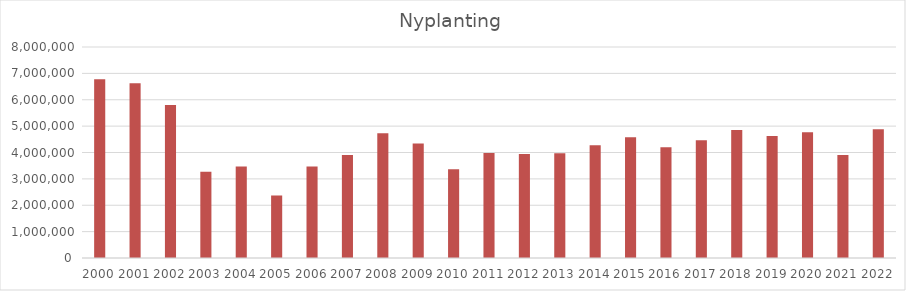
| Category | Nyplanting |
|---|---|
| 2000.0 | 6776969 |
| 2001.0 | 6622134 |
| 2002.0 | 5801712 |
| 2003.0 | 3271556 |
| 2004.0 | 3469386 |
| 2005.0 | 2370166 |
| 2006.0 | 3473699 |
| 2007.0 | 3902957 |
| 2008.0 | 4727511 |
| 2009.0 | 4345382 |
| 2010.0 | 3362757 |
| 2011.0 | 3984574 |
| 2012.0 | 3946714 |
| 2013.0 | 3968517 |
| 2014.0 | 4270889 |
| 2015.0 | 4574547 |
| 2016.0 | 4200212 |
| 2017.0 | 4468082 |
| 2018.0 | 4854955 |
| 2019.0 | 4623285 |
| 2020.0 | 4770709 |
| 2021.0 | 3901331 |
| 2022.0 | 4880230 |